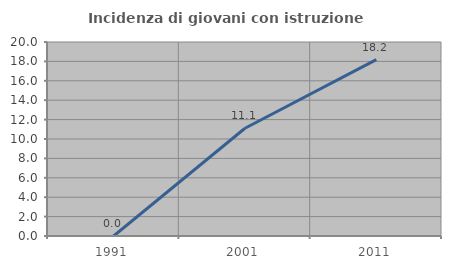
| Category | Incidenza di giovani con istruzione universitaria |
|---|---|
| 1991.0 | 0 |
| 2001.0 | 11.111 |
| 2011.0 | 18.182 |